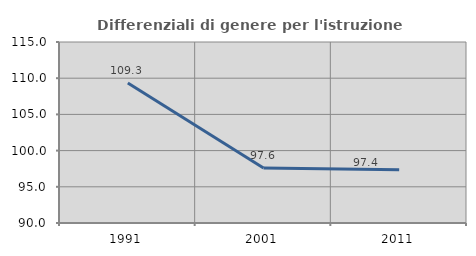
| Category | Differenziali di genere per l'istruzione superiore |
|---|---|
| 1991.0 | 109.333 |
| 2001.0 | 97.588 |
| 2011.0 | 97.367 |